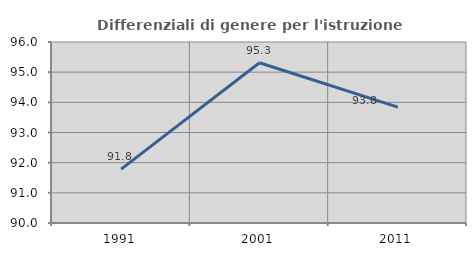
| Category | Differenziali di genere per l'istruzione superiore |
|---|---|
| 1991.0 | 91.787 |
| 2001.0 | 95.314 |
| 2011.0 | 93.843 |